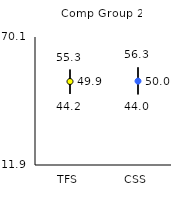
| Category | 25th | 75th | Mean |
|---|---|---|---|
| TFS | 44.2 | 55.3 | 49.86 |
| CSS | 44 | 56.3 | 50.04 |